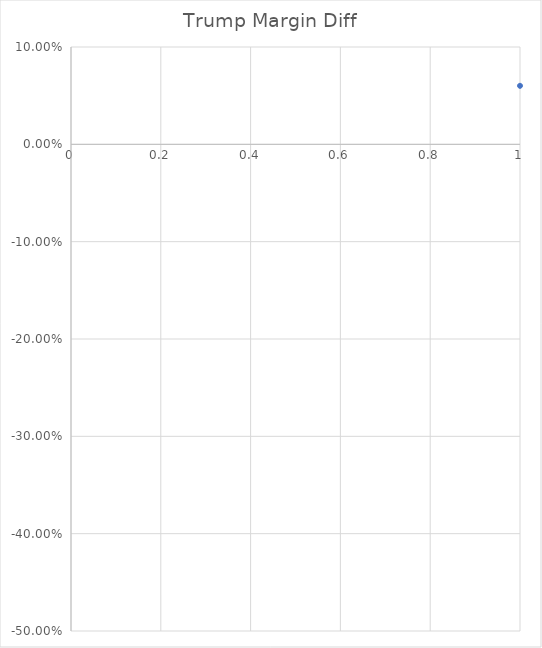
| Category | Trump Margin Diff |
|---|---|
| 0 | 0.06 |
| 1 | 0.042 |
| 2 | 0.035 |
| 3 | 0.032 |
| 4 | 0.03 |
| 5 | 0.03 |
| 6 | 0.027 |
| 7 | 0.021 |
| 8 | 0.019 |
| 9 | 0.015 |
| 10 | 0.014 |
| 11 | 0.012 |
| 12 | 0.01 |
| 13 | 0.01 |
| 14 | 0.01 |
| 15 | 0.008 |
| 16 | 0.008 |
| 17 | 0.007 |
| 18 | 0.006 |
| 19 | 0.003 |
| 20 | 0 |
| 21 | -0.002 |
| 22 | -0.005 |
| 23 | -0.005 |
| 24 | -0.007 |
| 25 | -0.008 |
| 26 | -0.01 |
| 27 | -0.011 |
| 28 | -0.019 |
| 29 | -0.021 |
| 30 | -0.022 |
| 31 | -0.023 |
| 32 | -0.023 |
| 33 | -0.024 |
| 34 | -0.024 |
| 35 | -0.032 |
| 36 | -0.04 |
| 37 | -0.05 |
| 38 | -0.069 |
| 39 | -0.094 |
| 40 | -0.122 |
| 41 | -0.199 |
| 42 | -0.398 |